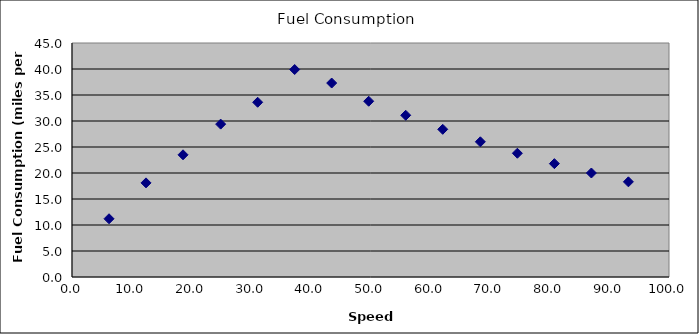
| Category | Series 0 |
|---|---|
| 6.2 | 11.2 |
| 12.4 | 18.1 |
| 18.6 | 23.5 |
| 24.9 | 29.4 |
| 31.1 | 33.6 |
| 37.3 | 39.9 |
| 43.5 | 37.3 |
| 49.7 | 33.8 |
| 55.9 | 31.1 |
| 62.1 | 28.4 |
| 68.4 | 26 |
| 74.6 | 23.8 |
| 80.8 | 21.8 |
| 87.0 | 20 |
| 93.2 | 18.3 |